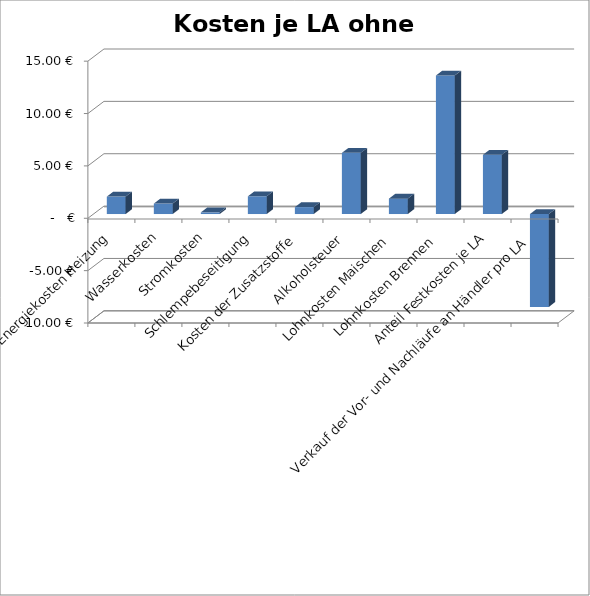
| Category | Kosten je LA ohne Vermarktung |
|---|---|
| Energiekosten Heizung | 1.667 |
| Wasserkosten | 1 |
| Stromkosten | 0.159 |
| Schlempebeseitigung | 1.693 |
| Kosten der Zusatzstoffe | 0.661 |
| Alkoholsteuer | 5.84 |
| Lohnkosten Maischen | 1.47 |
| Lohnkosten Brennen | 13.228 |
| Anteil Festkosten je LA | 5.657 |
| Verkauf der Vor- und Nachläufe an Händler pro LA | -8.867 |